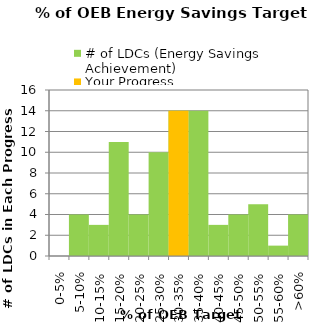
| Category | # of LDCs (Energy Savings Achievement) | Your Progress |
|---|---|---|
| 0-5% | 0 | 0 |
| 5-10% | 4 | 0 |
| 10-15% | 3 | 0 |
| 15-20% | 11 | 0 |
| 20-25% | 4 | 0 |
| 25-30% | 10 | 0 |
| 30-35% | 14 | 14 |
| 35-40% | 14 | 0 |
| 40-45% | 3 | 0 |
| 45-50% | 4 | 0 |
| 50-55% | 5 | 0 |
| 55-60% | 1 | 0 |
| >60% | 4 | 0 |